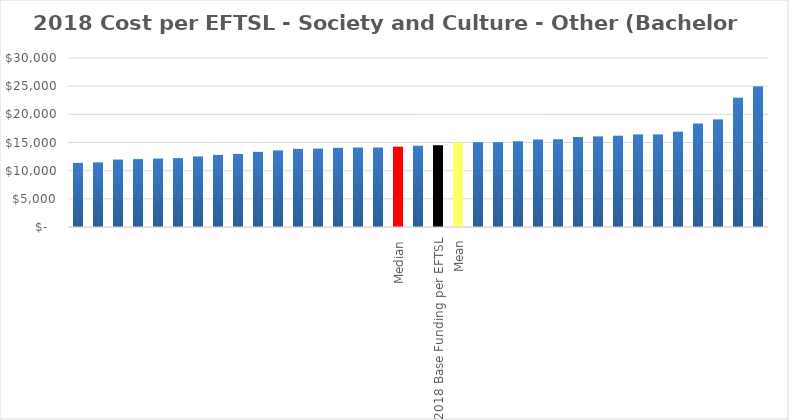
| Category | Series 0 |
|---|---|
|  | 11375.159 |
|  | 11475.69 |
|  | 11957.925 |
|  | 12051.44 |
|  | 12139.53 |
|  | 12232.366 |
|  | 12528.469 |
|  | 12792.792 |
|  | 12971.278 |
|  | 13334.481 |
|  | 13602.833 |
|  | 13861.173 |
|  | 13907.193 |
|  | 14049.68 |
|  | 14094.679 |
|  | 14114.07 |
| Median | 14265.712 |
|  | 14417.355 |
| 2018 Base Funding per EFTSL | 14519.635 |
| Mean | 15020.198 |